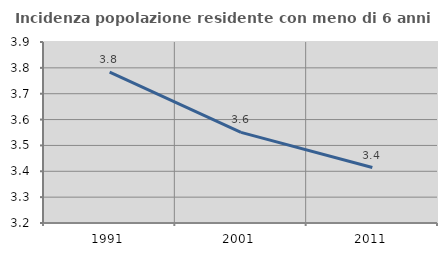
| Category | Incidenza popolazione residente con meno di 6 anni |
|---|---|
| 1991.0 | 3.784 |
| 2001.0 | 3.55 |
| 2011.0 | 3.415 |